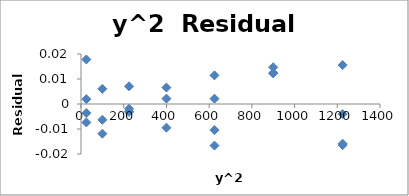
| Category | Series 0 |
|---|---|
| 25.0 | 0.018 |
| 225.0 | 0.007 |
| 625.0 | -0.01 |
| 1225.0 | -0.016 |
| 100.0 | -0.006 |
| 400.0 | -0.009 |
| 900.0 | 0.012 |
| 25.0 | -0.004 |
| 225.0 | -0.002 |
| 625.0 | 0.002 |
| 1225.0 | 0.016 |
| 100.0 | -0.012 |
| 400.0 | 0.002 |
| 900.0 | 0.015 |
| 25.0 | -0.007 |
| 225.0 | -0.003 |
| 625.0 | -0.017 |
| 1225.0 | -0.004 |
| 100.0 | 0.006 |
| 400.0 | 0.007 |
| 900.0 | 0.012 |
| 25.0 | 0.002 |
| 225.0 | -0.003 |
| 625.0 | 0.011 |
| 1225.0 | -0.016 |